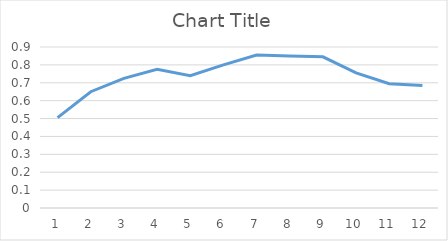
| Category | Series 0 |
|---|---|
| 0 | 0.505 |
| 1 | 0.65 |
| 2 | 0.725 |
| 3 | 0.775 |
| 4 | 0.74 |
| 5 | 0.8 |
| 6 | 0.855 |
| 7 | 0.85 |
| 8 | 0.845 |
| 9 | 0.755 |
| 10 | 0.695 |
| 11 | 0.685 |